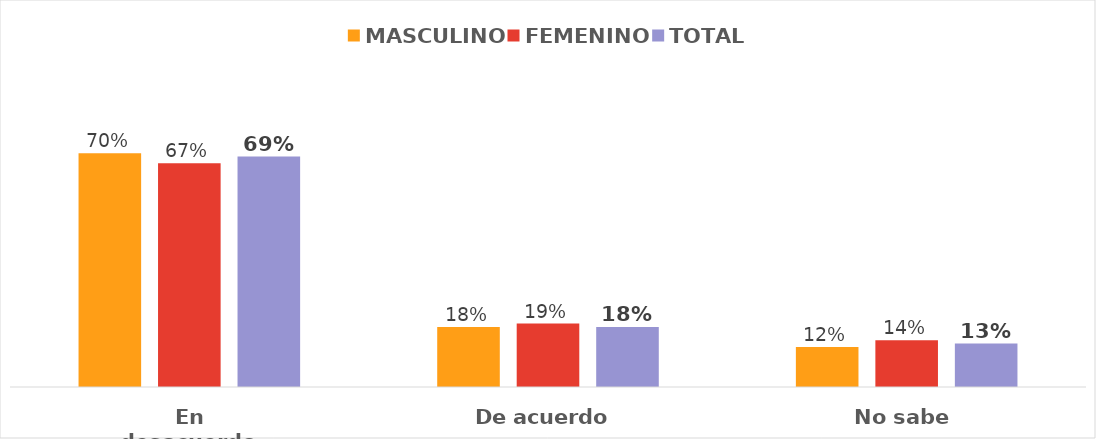
| Category | MASCULINO | FEMENINO | TOTAL |
|---|---|---|---|
| En desacuerdo | 0.7 | 0.67 | 0.69 |
| De acuerdo | 0.18 | 0.19 | 0.18 |
| No sabe | 0.12 | 0.14 | 0.13 |